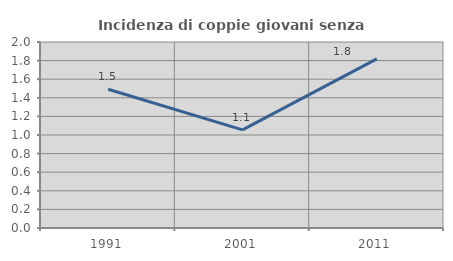
| Category | Incidenza di coppie giovani senza figli |
|---|---|
| 1991.0 | 1.493 |
| 2001.0 | 1.055 |
| 2011.0 | 1.818 |